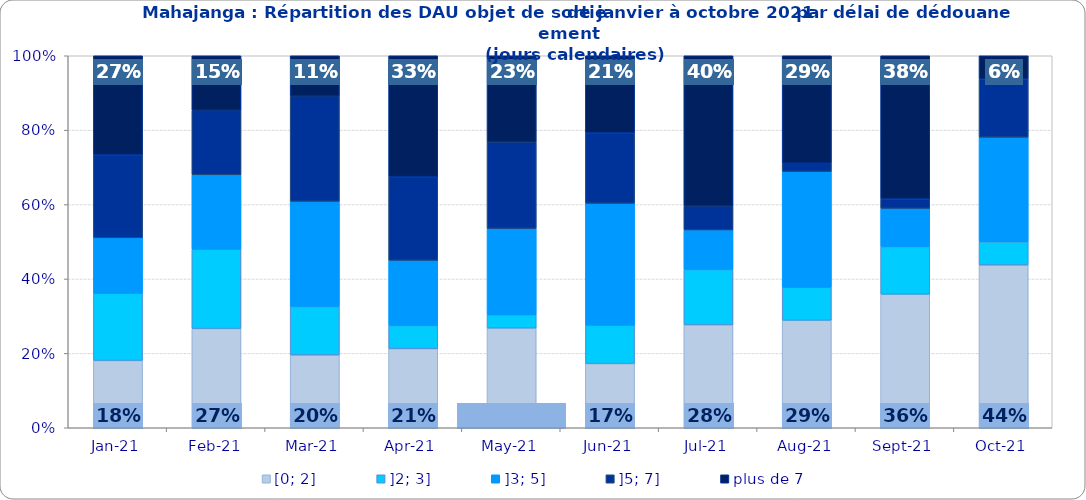
| Category | [0; 2] | ]2; 3] | ]3; 5] | ]5; 7] | plus de 7 |
|---|---|---|---|---|---|
| 2021-01-01 | 0.181 | 0.181 | 0.149 | 0.223 | 0.266 |
| 2021-02-01 | 0.267 | 0.213 | 0.2 | 0.173 | 0.147 |
| 2021-03-01 | 0.196 | 0.13 | 0.283 | 0.283 | 0.109 |
| 2021-04-01 | 0.212 | 0.062 | 0.175 | 0.225 | 0.325 |
| 2021-05-01 | 0.268 | 0.036 | 0.232 | 0.232 | 0.232 |
| 2021-06-01 | 0.172 | 0.103 | 0.328 | 0.19 | 0.207 |
| 2021-07-01 | 0.277 | 0.149 | 0.106 | 0.064 | 0.404 |
| 2021-08-01 | 0.289 | 0.089 | 0.311 | 0.022 | 0.289 |
| 2021-09-01 | 0.359 | 0.128 | 0.103 | 0.026 | 0.385 |
| 2021-10-01 | 0.438 | 0.062 | 0.281 | 0.156 | 0.062 |